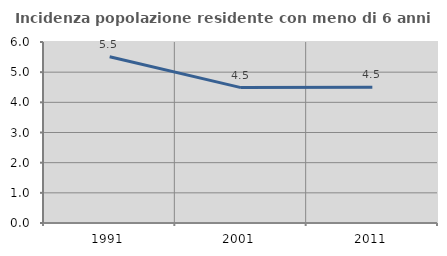
| Category | Incidenza popolazione residente con meno di 6 anni |
|---|---|
| 1991.0 | 5.512 |
| 2001.0 | 4.489 |
| 2011.0 | 4.499 |